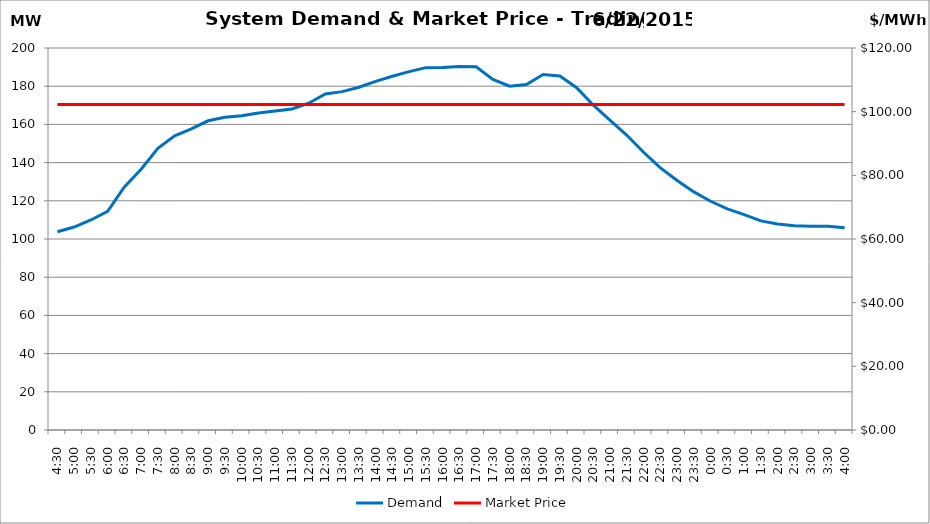
| Category | Demand |
|---|---|
| 0.1875 | 103.81 |
| 0.20833333333333334 | 106.27 |
| 0.22916666666666666 | 109.95 |
| 0.25 | 114.54 |
| 0.270833333333333 | 127.27 |
| 0.291666666666667 | 136.54 |
| 0.3125 | 147.51 |
| 0.333333333333333 | 154.02 |
| 0.354166666666667 | 157.62 |
| 0.375 | 161.89 |
| 0.395833333333333 | 163.73 |
| 0.416666666666667 | 164.55 |
| 0.4375 | 165.95 |
| 0.458333333333333 | 166.96 |
| 0.479166666666667 | 168.05 |
| 0.5 | 171.1 |
| 0.520833333333333 | 175.91 |
| 0.541666666666667 | 177.16 |
| 0.5625 | 179.44 |
| 0.583333333333333 | 182.55 |
| 0.604166666666667 | 185.2 |
| 0.625 | 187.61 |
| 0.645833333333334 | 189.71 |
| 0.666666666666667 | 189.79 |
| 0.6875 | 190.37 |
| 0.708333333333334 | 190.19 |
| 0.729166666666667 | 183.57 |
| 0.75 | 180.02 |
| 0.770833333333334 | 180.89 |
| 0.791666666666667 | 186.1 |
| 0.8125 | 185.32 |
| 0.833333333333334 | 179.23 |
| 0.854166666666667 | 170.07 |
| 0.875 | 162.16 |
| 0.895833333333334 | 154.31 |
| 0.916666666666667 | 145.41 |
| 0.9375 | 137.25 |
| 0.958333333333334 | 130.6 |
| 0.979166666666667 | 124.67 |
| 1900-01-01 | 119.76 |
| 1900-01-01 00:30:00 | 115.74 |
| 1900-01-01 01:00:00 | 112.72 |
| 1900-01-01 01:30:00 | 109.49 |
| 1900-01-01 02:00:00 | 107.82 |
| 1900-01-01 02:30:00 | 106.93 |
| 1900-01-01 03:00:00 | 106.67 |
| 1900-01-01 03:30:00 | 106.67 |
| 1900-01-01 04:00:00 | 105.92 |